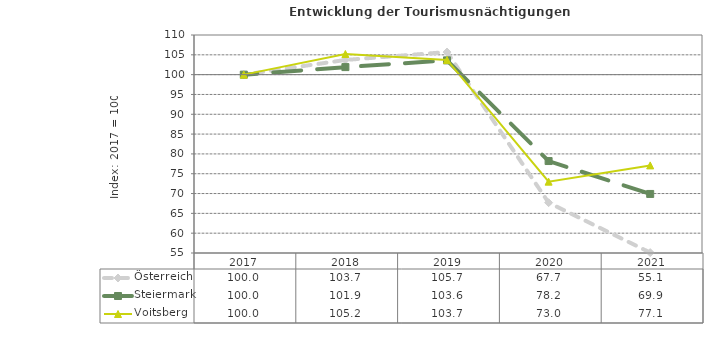
| Category | Österreich | Steiermark | Voitsberg |
|---|---|---|---|
| 2021.0 | 55.1 | 69.9 | 77.1 |
| 2020.0 | 67.7 | 78.2 | 73 |
| 2019.0 | 105.7 | 103.6 | 103.7 |
| 2018.0 | 103.7 | 101.9 | 105.2 |
| 2017.0 | 100 | 100 | 100 |